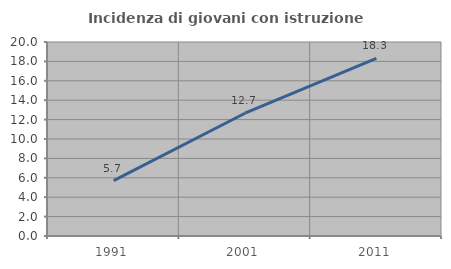
| Category | Incidenza di giovani con istruzione universitaria |
|---|---|
| 1991.0 | 5.714 |
| 2001.0 | 12.658 |
| 2011.0 | 18.31 |